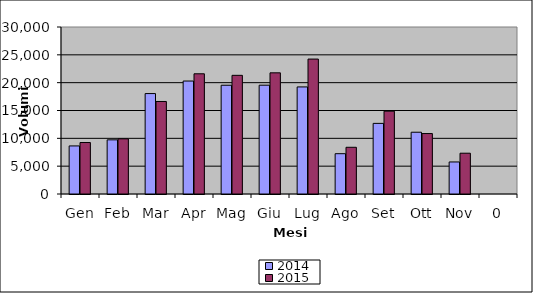
| Category | 2014 | 2015 |
|---|---|---|
| Gen | 8634 | 9246 |
| Feb | 9730 | 9910 |
| Mar | 18040 | 16621 |
| Apr | 20292 | 21596 |
| Mag | 19538 | 21316 |
| Giu | 19547 | 21767 |
| Lug | 19233 | 24240 |
| Ago | 7240 | 8390 |
| Set | 12685 | 14877 |
| Ott | 11096 | 10859 |
| Nov | 5756 | 7328 |
| 0 | 0 | 0 |